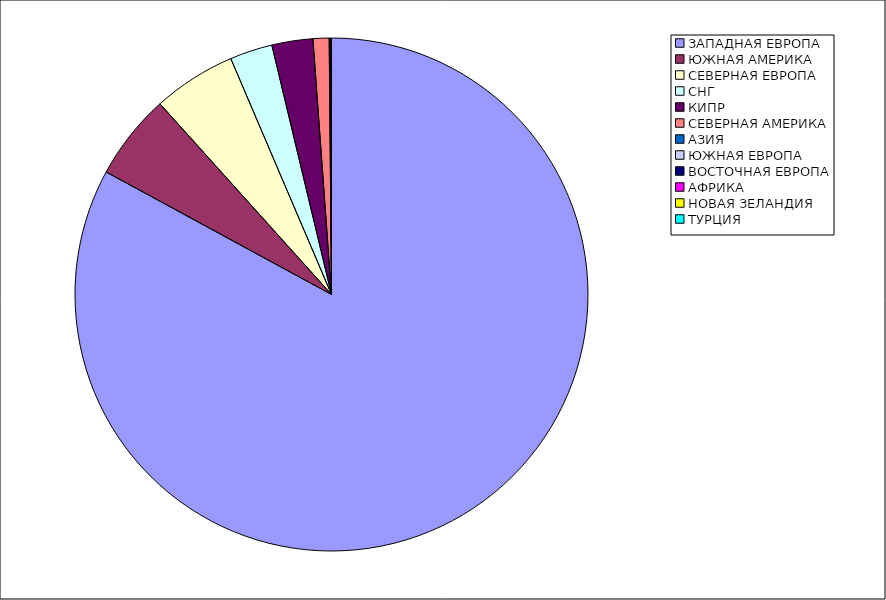
| Category | Оборот |
|---|---|
| ЗАПАДНАЯ ЕВРОПА | 0.829 |
| ЮЖНАЯ АМЕРИКА | 0.054 |
| СЕВЕРНАЯ ЕВРОПА | 0.052 |
| СНГ | 0.027 |
| КИПР | 0.026 |
| СЕВЕРНАЯ АМЕРИКА | 0.01 |
| АЗИЯ | 0.001 |
| ЮЖНАЯ ЕВРОПА | 0 |
| ВОСТОЧНАЯ ЕВРОПА | 0 |
| АФРИКА | 0 |
| НОВАЯ ЗЕЛАНДИЯ | 0 |
| ТУРЦИЯ | 0 |